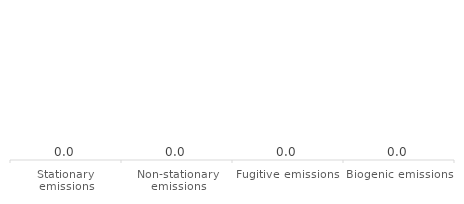
| Category | Series 0 |
|---|---|
| Stationary emissions | 0 |
| Non-stationary emissions | 0 |
| Fugitive emissions | 0 |
| Biogenic emissions | 0 |